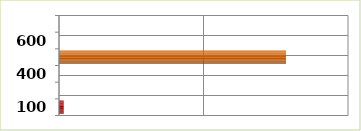
| Category | Series 0 |
|---|---|
| 100.0 | 654676 |
| 200.0 | 0 |
| 400.0 | 0 |
| 500.0 | 31418432 |
| 600.0 | 1200 |
| 700.0 | 0 |